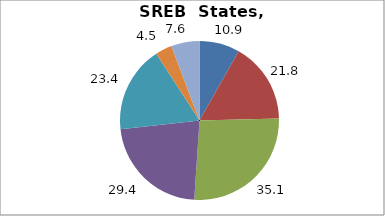
| Category | Series 0 |
|---|---|
| Higher Education | 10.881 |
| Elementary and Secondary Education | 21.763 |
| Total Education1 | 35.074 |
| Social Welfare2 | 29.415 |
| Transportation, Public Safety, Environment and Housing3 | 23.374 |
| Administration | 4.52 |
| Other4 | 7.618 |